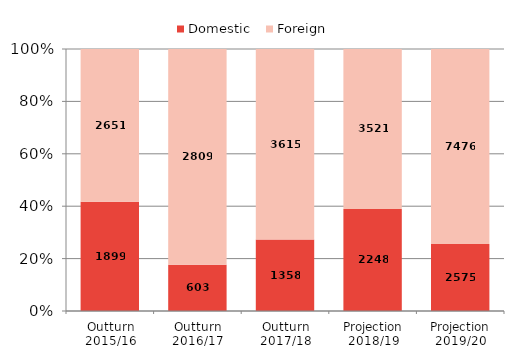
| Category | Domestic  | Foreign  |
|---|---|---|
| Outturn 2015/16 | 1899 | 2651 |
| Outturn 2016/17 | 603 | 2809 |
| Outturn 2017/18 | 1358 | 3615 |
| Projection 2018/19 | 2248 | 3521 |
| Projection 2019/20 | 2575 | 7476 |